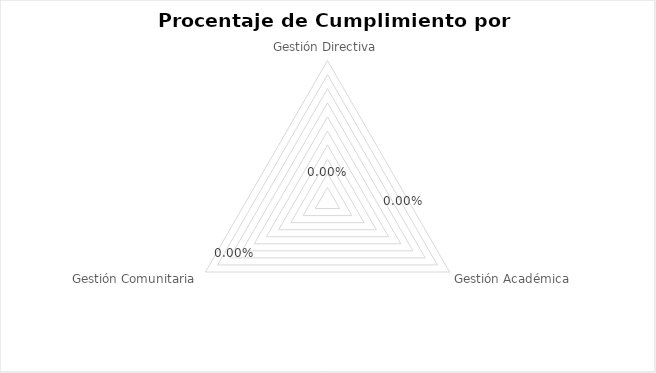
| Category | Series 0 |
|---|---|
| Gestión Directiva | 0 |
| Gestión Académica | 0 |
| Gestión Comunitaria | 0 |